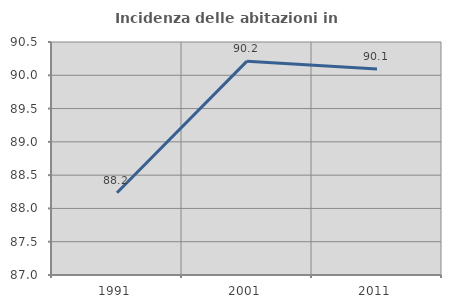
| Category | Incidenza delle abitazioni in proprietà  |
|---|---|
| 1991.0 | 88.235 |
| 2001.0 | 90.212 |
| 2011.0 | 90.094 |